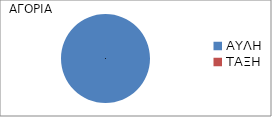
| Category | Series 0 |
|---|---|
| ΑΥΛΗ | 1 |
| ΤΑΞΗ | 0 |